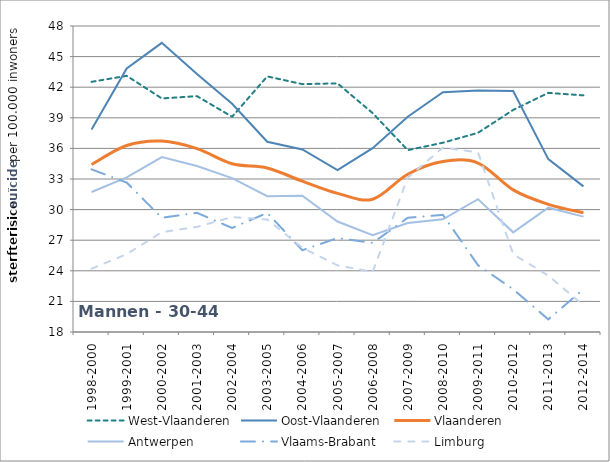
| Category | West-Vlaanderen | Oost-Vlaanderen | Vlaanderen | Antwerpen | Vlaams-Brabant | Limburg |
|---|---|---|---|---|---|---|
| 1998-2000 | 42.527 | 37.863 | 34.42 | 31.723 | 33.945 | 24.206 |
| 1999-2001 | 43.117 | 43.838 | 36.282 | 33.166 | 32.648 | 25.633 |
| 2000-2002 | 40.898 | 46.35 | 36.72 | 35.156 | 29.199 | 27.785 |
| 2001-2003 | 41.124 | 43.294 | 35.979 | 34.274 | 29.687 | 28.307 |
| 2002-2004 | 39.104 | 40.377 | 34.499 | 33.087 | 28.198 | 29.267 |
| 2003-2005 | 43.059 | 36.652 | 34.082 | 31.309 | 29.678 | 29.023 |
| 2004-2006 | 42.3 | 35.896 | 32.783 | 31.352 | 26.016 | 26.258 |
| 2005-2007 | 42.375 | 33.863 | 31.595 | 28.828 | 27.211 | 24.538 |
| 2006-2008 | 39.46 | 36.025 | 31.022 | 27.484 | 26.731 | 23.887 |
| 2007-2009 | 35.828 | 39.106 | 33.468 | 28.686 | 29.201 | 33.138 |
| 2008-2010 | 36.556 | 41.51 | 34.706 | 29.043 | 29.484 | 36.077 |
| 2009-2011 | 37.531 | 41.675 | 34.565 | 31.025 | 24.549 | 35.614 |
| 2010-2012 | 39.768 | 41.628 | 31.933 | 27.77 | 22.191 | 25.63 |
| 2011-2013 | 41.445 | 34.951 | 30.517 | 30.188 | 19.236 | 23.525 |
| 2012-2014 | 41.2 | 32.279 | 29.693 | 29.31 | 22.191 | 20.614 |